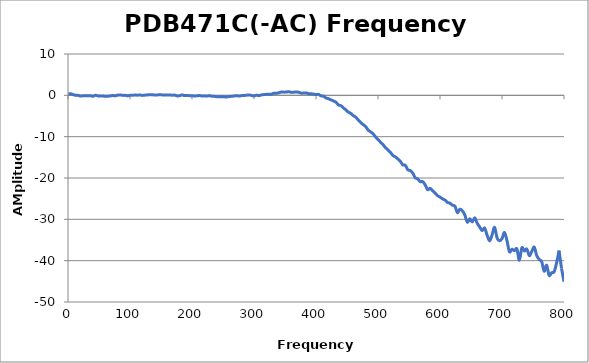
| Category | Series 0 |
|---|---|
| 0.3 | 0.37 |
| 4.2985 | 0.357 |
| 8.297 | 0.184 |
| 12.2955 | 0 |
| 16.294 | -0.015 |
| 20.2925 | -0.177 |
| 24.291 | -0.093 |
| 28.2895 | -0.084 |
| 32.288 | -0.109 |
| 36.2865 | -0.088 |
| 40.285 | -0.227 |
| 44.2835 | 0.011 |
| 48.282 | -0.148 |
| 52.2805 | -0.148 |
| 56.279 | -0.172 |
| 60.2775 | -0.226 |
| 64.276 | -0.211 |
| 68.2745 | -0.152 |
| 72.273 | -0.042 |
| 76.2715 | -0.124 |
| 80.27 | 0.057 |
| 84.2685 | 0.103 |
| 88.267 | -0.011 |
| 92.2655 | -0.006 |
| 96.264 | -0.119 |
| 100.263 | 0.021 |
| 104.261 | 0.036 |
| 108.26 | 0.06 |
| 112.258 | 0.047 |
| 116.257 | 0.073 |
| 120.255 | -0.018 |
| 124.254 | 0.05 |
| 128.252 | 0.101 |
| 132.251 | 0.154 |
| 136.249 | 0.137 |
| 140.248 | 0.069 |
| 144.246 | 0.099 |
| 148.245 | 0.145 |
| 152.243 | 0.104 |
| 156.242 | 0.079 |
| 160.24 | 0.077 |
| 164.239 | 0.109 |
| 168.237 | 0.022 |
| 172.236 | 0.056 |
| 176.234 | -0.145 |
| 180.233 | -0.062 |
| 184.231 | 0.094 |
| 188.23 | -0.066 |
| 192.228 | -0.036 |
| 196.227 | -0.079 |
| 200.225 | -0.11 |
| 204.223 | -0.145 |
| 208.222 | -0.113 |
| 212.221 | -0.057 |
| 216.219 | -0.15 |
| 220.218 | -0.13 |
| 224.216 | -0.161 |
| 228.215 | -0.106 |
| 232.213 | -0.22 |
| 236.212 | -0.249 |
| 240.21 | -0.322 |
| 244.209 | -0.317 |
| 248.207 | -0.333 |
| 252.206 | -0.369 |
| 256.204 | -0.379 |
| 260.203 | -0.271 |
| 264.201 | -0.234 |
| 268.2 | -0.155 |
| 272.198 | -0.083 |
| 276.197 | -0.188 |
| 280.195 | -0.051 |
| 284.194 | -0.04 |
| 288.192 | 0.038 |
| 292.191 | 0.099 |
| 296.189 | -0.042 |
| 300.188 | -0.133 |
| 304.186 | 0.038 |
| 308.185 | -0.074 |
| 312.183 | 0.116 |
| 316.182 | 0.183 |
| 320.18 | 0.237 |
| 324.179 | 0.244 |
| 328.177 | 0.281 |
| 332.176 | 0.516 |
| 336.174 | 0.511 |
| 340.173 | 0.628 |
| 344.171 | 0.796 |
| 348.17 | 0.774 |
| 352.168 | 0.791 |
| 356.167 | 0.895 |
| 360.165 | 0.718 |
| 364.164 | 0.752 |
| 368.162 | 0.829 |
| 372.161 | 0.733 |
| 376.159 | 0.534 |
| 380.158 | 0.55 |
| 384.156 | 0.576 |
| 388.155 | 0.411 |
| 392.153 | 0.371 |
| 396.152 | 0.306 |
| 400.15 | 0.204 |
| 404.149 | 0.228 |
| 408.147 | -0.142 |
| 412.146 | -0.214 |
| 416.144 | -0.638 |
| 420.143 | -0.809 |
| 424.141 | -1.099 |
| 428.14 | -1.35 |
| 432.138 | -1.665 |
| 436.137 | -2.322 |
| 440.135 | -2.497 |
| 444.133 | -3.038 |
| 448.132 | -3.519 |
| 452.131 | -4.051 |
| 456.129 | -4.368 |
| 460.128 | -4.918 |
| 464.126 | -5.272 |
| 468.124 | -5.956 |
| 472.123 | -6.574 |
| 476.122 | -7.079 |
| 480.12 | -7.55 |
| 484.119 | -8.415 |
| 488.117 | -8.83 |
| 492.116 | -9.328 |
| 496.114 | -10.063 |
| 500.113 | -10.68 |
| 504.111 | -11.343 |
| 508.11 | -11.93 |
| 512.108 | -12.656 |
| 516.107 | -13.211 |
| 520.105 | -13.835 |
| 524.104 | -14.558 |
| 528.102 | -14.892 |
| 532.1 | -15.402 |
| 536.099 | -15.982 |
| 540.098 | -16.825 |
| 544.096 | -16.924 |
| 548.095 | -18.006 |
| 552.093 | -18.206 |
| 556.092 | -18.824 |
| 560.09 | -19.944 |
| 564.089 | -20.227 |
| 568.087 | -20.887 |
| 572.086 | -20.863 |
| 576.084 | -21.663 |
| 580.083 | -22.827 |
| 584.081 | -22.499 |
| 588.08 | -23.085 |
| 592.078 | -23.631 |
| 596.077 | -24.277 |
| 600.075 | -24.611 |
| 604.074 | -25.045 |
| 608.072 | -25.347 |
| 612.071 | -25.901 |
| 616.069 | -26.106 |
| 620.068 | -26.586 |
| 624.066 | -26.821 |
| 628.065 | -28.375 |
| 632.063 | -27.542 |
| 636.062 | -27.947 |
| 640.06 | -28.945 |
| 644.059 | -30.688 |
| 648.057 | -29.853 |
| 652.056 | -30.623 |
| 656.054 | -29.631 |
| 660.053 | -30.941 |
| 664.051 | -31.863 |
| 668.05 | -32.725 |
| 672.048 | -32.107 |
| 676.047 | -33.874 |
| 680.045 | -35.205 |
| 684.044 | -33.729 |
| 688.042 | -31.938 |
| 692.041 | -34.495 |
| 696.039 | -35.168 |
| 700.038 | -34.679 |
| 704.036 | -33.18 |
| 708.035 | -35.156 |
| 712.033 | -37.854 |
| 716.032 | -37.227 |
| 720.03 | -37.581 |
| 724.029 | -37.139 |
| 728.027 | -39.904 |
| 732.026 | -36.872 |
| 736.024 | -37.662 |
| 740.023 | -37.188 |
| 744.021 | -38.786 |
| 748.02 | -37.767 |
| 752.018 | -36.715 |
| 756.017 | -38.792 |
| 760.015 | -39.692 |
| 764.014 | -40.229 |
| 768.012 | -42.553 |
| 772.011 | -41.109 |
| 776.009 | -43.577 |
| 780.008 | -42.915 |
| 784.006 | -42.711 |
| 788.005 | -40.545 |
| 792.003 | -37.555 |
| 796.002 | -41.88 |
| 800.0 | -45.085 |